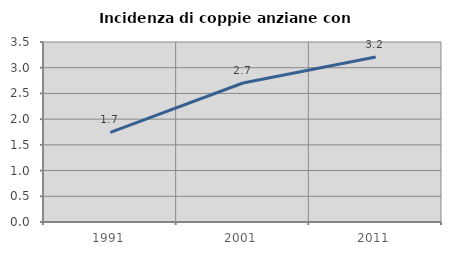
| Category | Incidenza di coppie anziane con figli |
|---|---|
| 1991.0 | 1.743 |
| 2001.0 | 2.703 |
| 2011.0 | 3.208 |